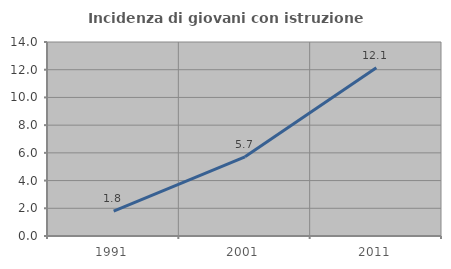
| Category | Incidenza di giovani con istruzione universitaria |
|---|---|
| 1991.0 | 1.802 |
| 2001.0 | 5.714 |
| 2011.0 | 12.15 |